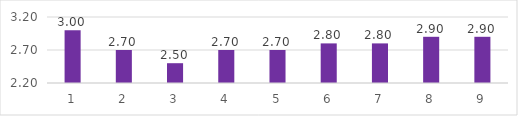
| Category | Series 0 |
|---|---|
| 0 | 3 |
| 1 | 2.7 |
| 2 | 2.5 |
| 3 | 2.7 |
| 4 | 2.7 |
| 5 | 2.8 |
| 6 | 2.8 |
| 7 | 2.9 |
| 8 | 2.9 |